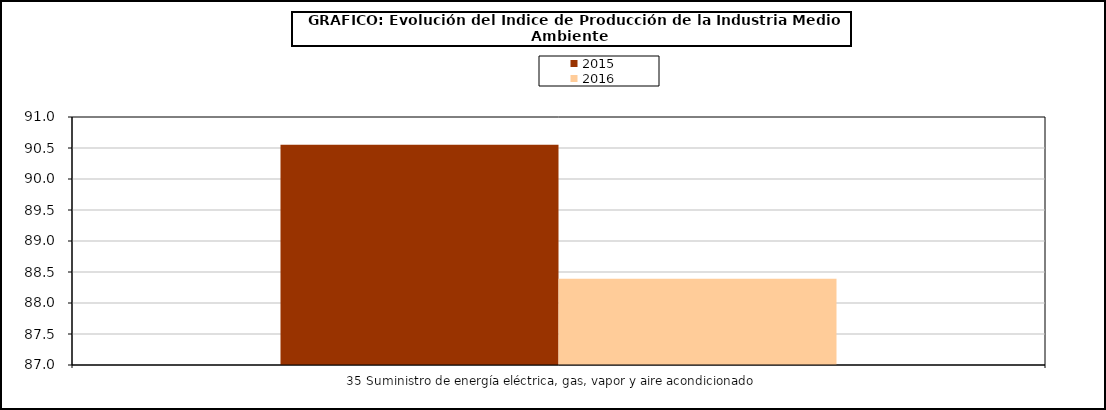
| Category | 2015 | 2016 |
|---|---|---|
| 35 Suministro de energía eléctrica, gas, vapor y aire acondicionado     | 90.55 | 88.39 |